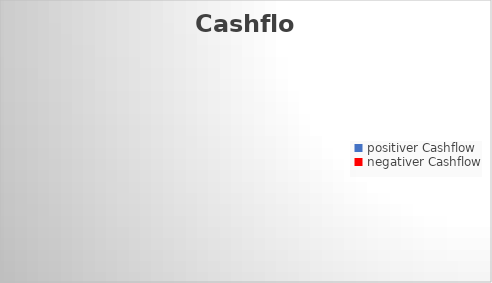
| Category | Series 0 |
|---|---|
| positiver Cashflow | 0 |
| negativer Cashflow | 0 |